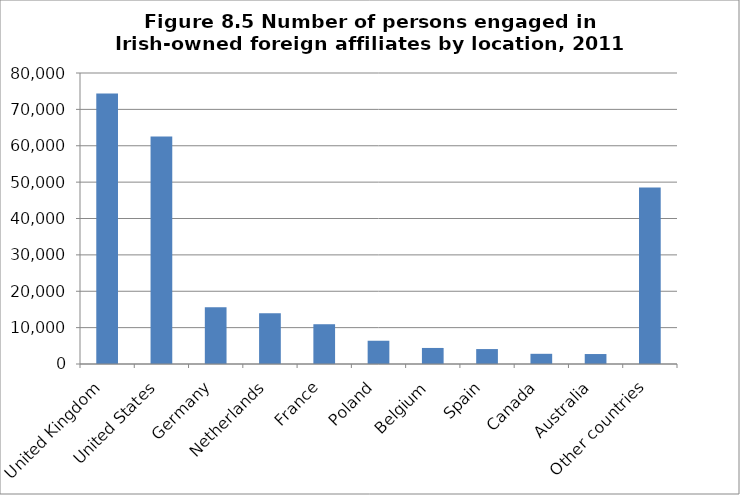
| Category | Persons Engaged (Number) |
|---|---|
| United Kingdom | 74330 |
| United States | 62514 |
| Germany | 15591 |
| Netherlands | 13924 |
| France | 10933 |
| Poland | 6395 |
| Belgium | 4412 |
| Spain | 4106 |
| Canada | 2803 |
| Australia | 2740 |
| Other countries | 48502 |